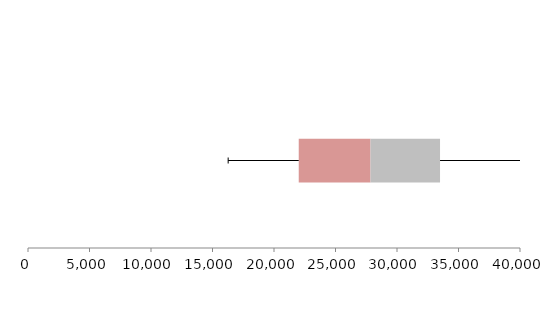
| Category | Series 1 | Series 2 | Series 3 |
|---|---|---|---|
| 0 | 22011.392 | 5834.897 | 5652.428 |